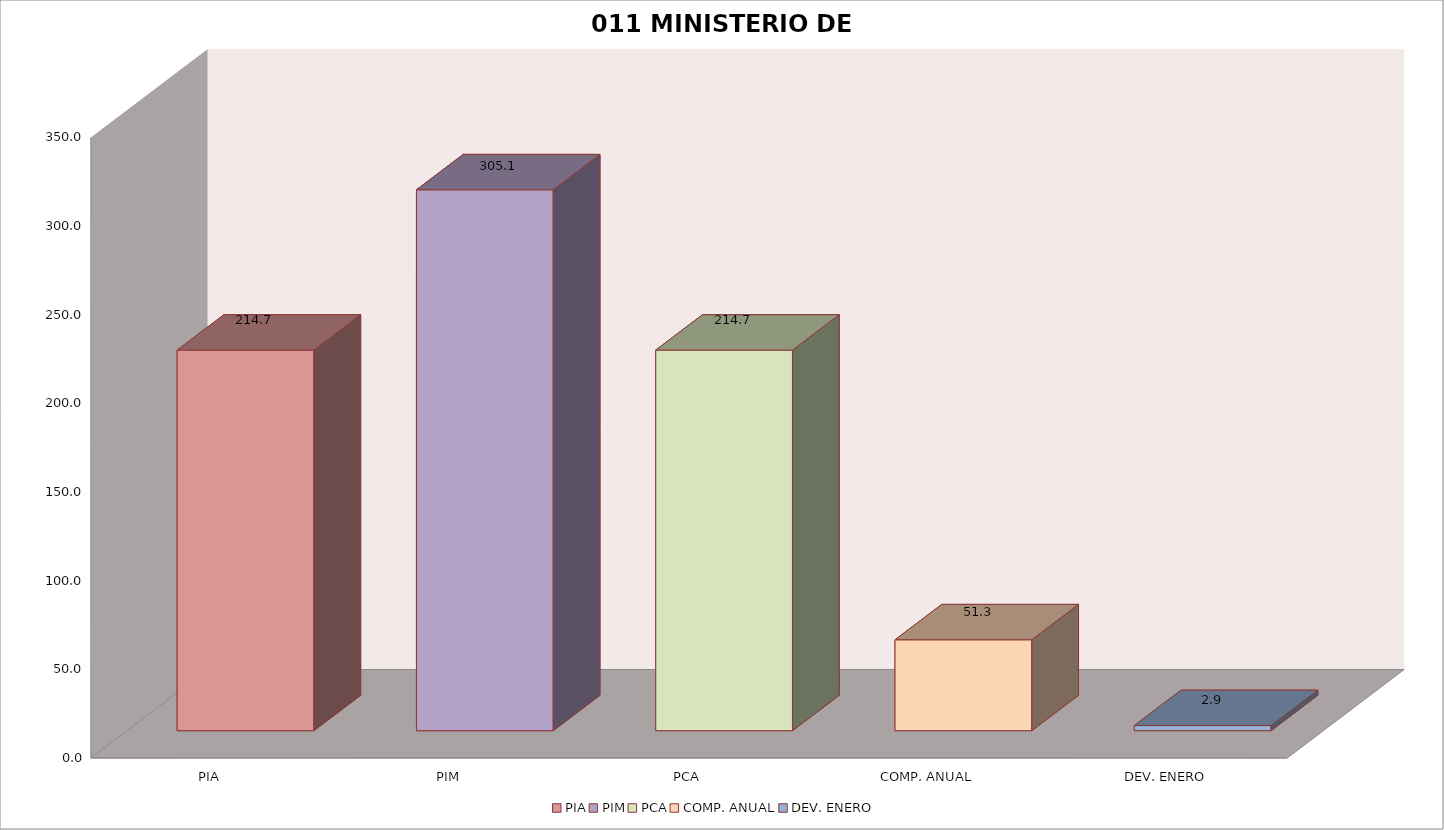
| Category | 011 MINISTERIO DE SALUD |
|---|---|
| PIA | 214.675 |
| PIM | 305.104 |
| PCA | 214.675 |
| COMP. ANUAL | 51.292 |
| DEV. ENERO | 2.897 |